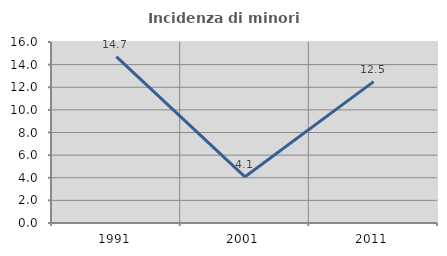
| Category | Incidenza di minori stranieri |
|---|---|
| 1991.0 | 14.706 |
| 2001.0 | 4.082 |
| 2011.0 | 12.5 |